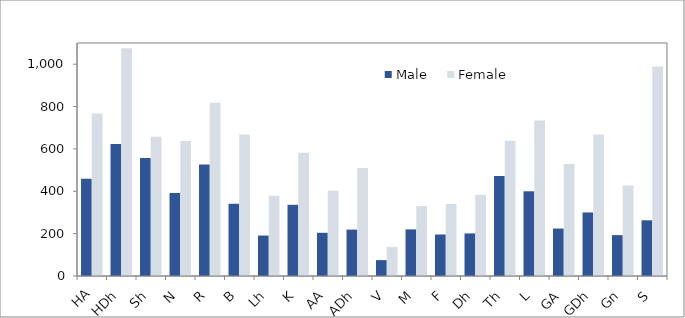
| Category | Male | Female |
|---|---|---|
| HA | 459 | 767 |
| HDh | 623 | 1075 |
| Sh | 557 | 657 |
| N | 392 | 637 |
| R | 526 | 818 |
| B | 341 | 668 |
| Lh | 191 | 379 |
| K | 336 | 582 |
| AA | 204 | 402 |
| ADh | 219 | 510 |
| V | 75 | 137 |
| M | 220 | 330 |
| F | 196 | 340 |
| Dh | 201 | 383 |
| Th | 472 | 639 |
| L | 400 | 734 |
| GA | 224 | 529 |
| GDh | 300 | 668 |
| Gn | 193 | 427 |
| S | 263 | 989 |